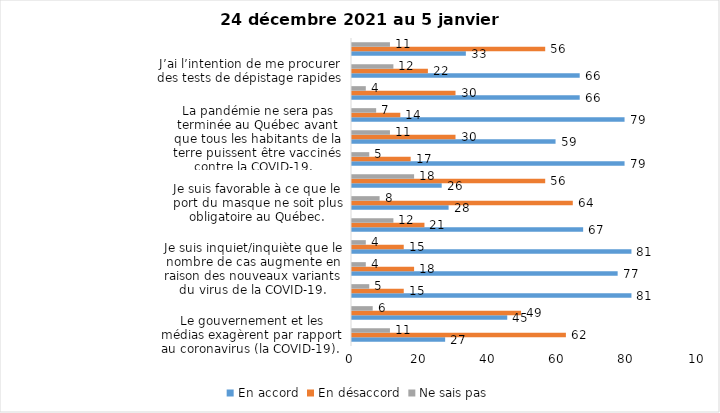
| Category | En accord | En désaccord | Ne sais pas |
|---|---|---|---|
| Le gouvernement et les médias exagèrent par rapport au coronavirus (la COVID-19). | 27 | 62 | 11 |
| Je suis favorable à la mise en place d’un couvre-feu. | 45 | 49 | 6 |
| J’ai peur que le système de santé soit débordé par les cas de COVID-19. | 81 | 15 | 5 |
| Je suis inquiet/inquiète que le nombre de cas augmente en raison des nouveaux variants du virus de la COVID-19. | 77 | 18 | 4 |
| Je suis favorable au passeport vaccinal qui permettrait l'accès à certains lieux ou activités aux personnes vaccinées. | 81 | 15 | 4 |
| Je suis confiant que la vaccination protège efficacement contre les variants de la COVID-19 | 67 | 21 | 12 |
| Je suis favorable à ce que le port du masque ne soit plus obligatoire au Québec. | 28 | 64 | 8 |
| La vaccination des enfants entre 5 et 11 ans mettra fin à la pandémie. | 26 | 56 | 18 |
| Il est important d'avoir des mesures de prévention pour la période des fêtes afin de limiter la propagation de la COVID-19. | 79 | 17 | 5 |
| La pandémie ne sera pas terminée au Québec avant que tous les habitants de la terre puissent être vaccinés contre la COVID-19.   | 59 | 30 | 11 |
| La dose de rappel (3e dose) de vaccin contre la COVID-19 devrait être offerte à toutes les personnes de 18 ans et plus.  | 79 | 14 | 7 |
| Je suis inconfortable d’être en contact avec une personne non vaccinée contre la COVID-19 | 66 | 30 | 4 |
| J’ai l’intention de me procurer des tests de dépistage rapides | 66 | 22 | 12 |
| Je n'ai pas peur du variant Omicron, car il semble moins dangereux pour la santé. | 33 | 56 | 11 |